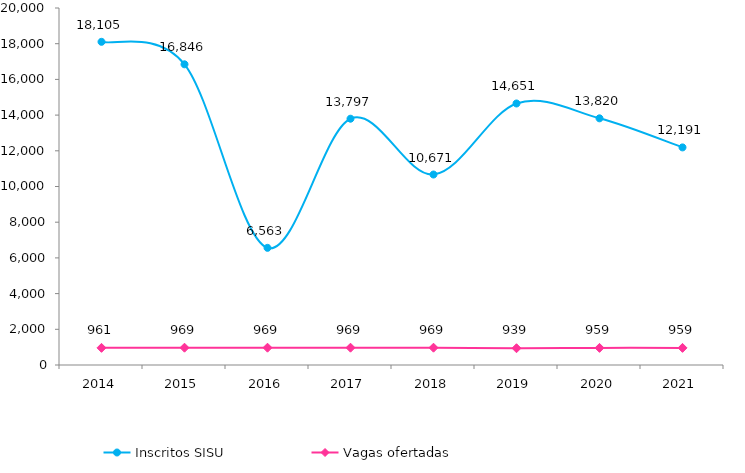
| Category | Inscritos SISU |
|---|---|
| 2014.0 | 18105 |
| 2015.0 | 16846 |
| 2016.0 | 6563 |
| 2017.0 | 13797 |
| 2018.0 | 10671 |
| 2019.0 | 14651 |
| 2020.0 | 13820 |
| 2021.0 | 12191 |